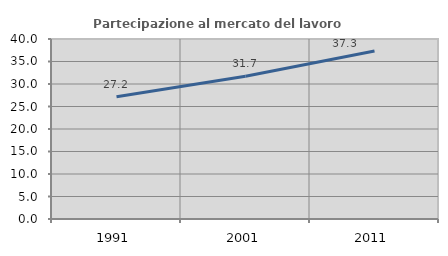
| Category | Partecipazione al mercato del lavoro  femminile |
|---|---|
| 1991.0 | 27.162 |
| 2001.0 | 31.741 |
| 2011.0 | 37.349 |